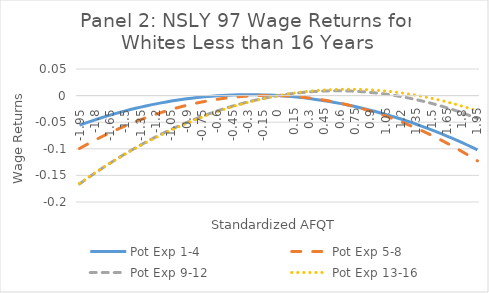
| Category | Pot Exp 1-4 | Pot Exp 5-8 | Pot Exp 9-12 | Pot Exp 13-16 |
|---|---|---|---|---|
| -1.95 | -0.056 | -0.099 | -0.166 | -0.165 |
| -1.9 | -0.052 | -0.094 | -0.159 | -0.158 |
| -1.8499999999999999 | -0.049 | -0.089 | -0.152 | -0.152 |
| -1.7999999999999998 | -0.046 | -0.084 | -0.146 | -0.145 |
| -1.7499999999999998 | -0.043 | -0.079 | -0.139 | -0.139 |
| -1.6999999999999997 | -0.04 | -0.074 | -0.133 | -0.133 |
| -1.6499999999999997 | -0.037 | -0.07 | -0.127 | -0.127 |
| -1.5999999999999996 | -0.034 | -0.065 | -0.121 | -0.121 |
| -1.5499999999999996 | -0.031 | -0.061 | -0.115 | -0.115 |
| -1.4999999999999996 | -0.029 | -0.057 | -0.109 | -0.11 |
| -1.4499999999999995 | -0.026 | -0.053 | -0.103 | -0.104 |
| -1.3999999999999995 | -0.024 | -0.049 | -0.098 | -0.099 |
| -1.3499999999999994 | -0.022 | -0.045 | -0.093 | -0.094 |
| -1.2999999999999994 | -0.02 | -0.042 | -0.087 | -0.088 |
| -1.2499999999999993 | -0.017 | -0.038 | -0.082 | -0.083 |
| -1.1999999999999993 | -0.016 | -0.035 | -0.077 | -0.079 |
| -1.1499999999999992 | -0.014 | -0.032 | -0.073 | -0.074 |
| -1.0999999999999992 | -0.012 | -0.029 | -0.068 | -0.069 |
| -1.0499999999999992 | -0.01 | -0.026 | -0.063 | -0.065 |
| -0.9999999999999991 | -0.009 | -0.023 | -0.059 | -0.06 |
| -0.9499999999999991 | -0.007 | -0.021 | -0.055 | -0.056 |
| -0.899999999999999 | -0.006 | -0.018 | -0.051 | -0.052 |
| -0.849999999999999 | -0.005 | -0.016 | -0.047 | -0.048 |
| -0.7999999999999989 | -0.004 | -0.014 | -0.043 | -0.044 |
| -0.7499999999999989 | -0.003 | -0.012 | -0.039 | -0.041 |
| -0.6999999999999988 | -0.002 | -0.01 | -0.036 | -0.037 |
| -0.6499999999999988 | -0.001 | -0.008 | -0.032 | -0.033 |
| -0.5999999999999988 | 0 | -0.007 | -0.029 | -0.03 |
| -0.5499999999999987 | 0 | -0.006 | -0.026 | -0.027 |
| -0.4999999999999987 | 0.001 | -0.004 | -0.023 | -0.024 |
| -0.44999999999999873 | 0.001 | -0.003 | -0.02 | -0.021 |
| -0.39999999999999875 | 0.001 | -0.002 | -0.017 | -0.018 |
| -0.34999999999999876 | 0.002 | -0.001 | -0.014 | -0.015 |
| -0.29999999999999877 | 0.002 | -0.001 | -0.012 | -0.013 |
| -0.24999999999999878 | 0.002 | 0 | -0.01 | -0.01 |
| -0.1999999999999988 | 0.002 | 0 | -0.007 | -0.008 |
| -0.1499999999999988 | 0.001 | 0 | -0.005 | -0.006 |
| -0.0999999999999988 | 0.001 | 0 | -0.003 | -0.004 |
| -0.049999999999998795 | 0.001 | 0 | -0.002 | -0.002 |
| 0.0 | 0 | 0 | 0 | 0 |
| 0.05 | -0.001 | 0 | 0.002 | 0.002 |
| 0.1 | -0.001 | -0.001 | 0.003 | 0.003 |
| 0.15000000000000002 | -0.002 | -0.002 | 0.004 | 0.005 |
| 0.2 | -0.003 | -0.002 | 0.005 | 0.006 |
| 0.25 | -0.004 | -0.003 | 0.006 | 0.007 |
| 0.3 | -0.005 | -0.004 | 0.007 | 0.008 |
| 0.35 | -0.007 | -0.006 | 0.008 | 0.009 |
| 0.39999999999999997 | -0.008 | -0.007 | 0.008 | 0.01 |
| 0.44999999999999996 | -0.01 | -0.009 | 0.009 | 0.011 |
| 0.49999999999999994 | -0.011 | -0.01 | 0.009 | 0.011 |
| 0.5499999999999999 | -0.013 | -0.012 | 0.009 | 0.011 |
| 0.6 | -0.015 | -0.014 | 0.009 | 0.012 |
| 0.65 | -0.016 | -0.016 | 0.009 | 0.012 |
| 0.7000000000000001 | -0.018 | -0.018 | 0.009 | 0.012 |
| 0.7500000000000001 | -0.021 | -0.021 | 0.008 | 0.012 |
| 0.8000000000000002 | -0.023 | -0.023 | 0.008 | 0.012 |
| 0.8500000000000002 | -0.025 | -0.026 | 0.007 | 0.011 |
| 0.9000000000000002 | -0.027 | -0.029 | 0.006 | 0.011 |
| 0.9500000000000003 | -0.03 | -0.032 | 0.005 | 0.01 |
| 1.0000000000000002 | -0.033 | -0.035 | 0.004 | 0.009 |
| 1.0500000000000003 | -0.035 | -0.038 | 0.003 | 0.009 |
| 1.1000000000000003 | -0.038 | -0.042 | 0.001 | 0.008 |
| 1.1500000000000004 | -0.041 | -0.045 | 0 | 0.006 |
| 1.2000000000000004 | -0.044 | -0.049 | -0.002 | 0.005 |
| 1.2500000000000004 | -0.047 | -0.053 | -0.004 | 0.004 |
| 1.3000000000000005 | -0.05 | -0.057 | -0.006 | 0.002 |
| 1.3500000000000005 | -0.054 | -0.061 | -0.008 | 0.001 |
| 1.4000000000000006 | -0.057 | -0.066 | -0.01 | -0.001 |
| 1.4500000000000006 | -0.061 | -0.07 | -0.012 | -0.003 |
| 1.5000000000000007 | -0.064 | -0.075 | -0.015 | -0.005 |
| 1.5500000000000007 | -0.068 | -0.079 | -0.017 | -0.007 |
| 1.6000000000000008 | -0.072 | -0.084 | -0.02 | -0.009 |
| 1.6500000000000008 | -0.076 | -0.089 | -0.023 | -0.012 |
| 1.7000000000000008 | -0.08 | -0.095 | -0.026 | -0.014 |
| 1.7500000000000009 | -0.084 | -0.1 | -0.029 | -0.017 |
| 1.800000000000001 | -0.088 | -0.105 | -0.032 | -0.02 |
| 1.850000000000001 | -0.093 | -0.111 | -0.036 | -0.023 |
| 1.900000000000001 | -0.097 | -0.117 | -0.039 | -0.026 |
| 1.950000000000001 | -0.102 | -0.123 | -0.043 | -0.029 |